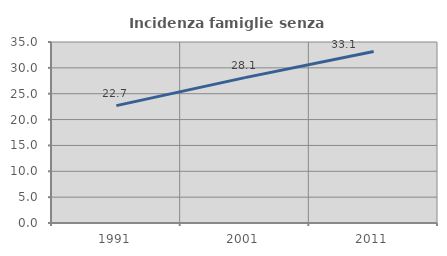
| Category | Incidenza famiglie senza nuclei |
|---|---|
| 1991.0 | 22.691 |
| 2001.0 | 28.112 |
| 2011.0 | 33.146 |